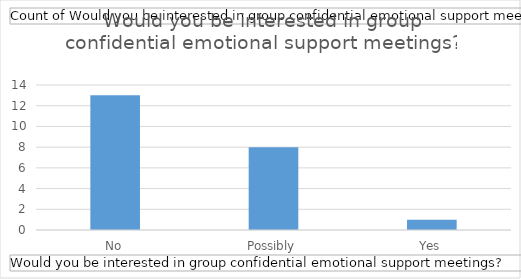
| Category | Total |
|---|---|
| No | 13 |
| Possibly | 8 |
| Yes | 1 |